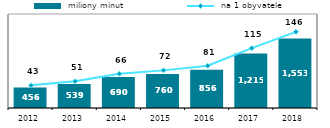
| Category |  miliony minut |
|---|---|
| 2012.0 | 456.255 |
| 2013.0 | 538.653 |
| 2014.0 | 690.463 |
| 2015.0 | 760.432 |
| 2016.0 | 856.404 |
| 2017.0 | 1215.436 |
| 2018.0 | 1553.103 |